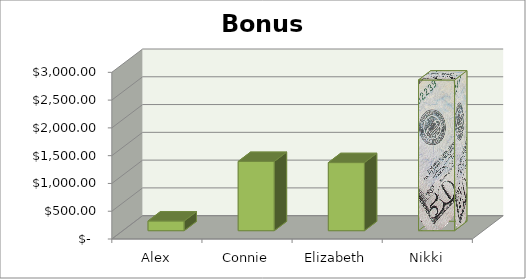
| Category | Bonus |
|---|---|
| Alex | 175 |
| Connie | 1246.5 |
| Elizabeth | 1225.5 |
| Nikki | 2712 |